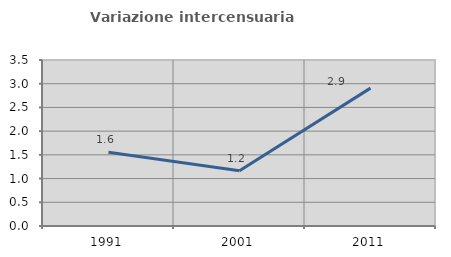
| Category | Variazione intercensuaria annua |
|---|---|
| 1991.0 | 1.557 |
| 2001.0 | 1.163 |
| 2011.0 | 2.907 |